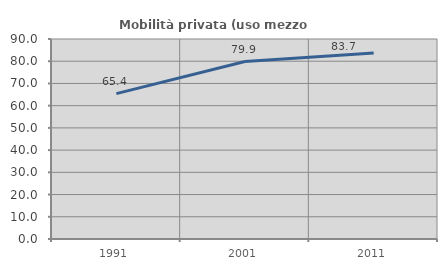
| Category | Mobilità privata (uso mezzo privato) |
|---|---|
| 1991.0 | 65.42 |
| 2001.0 | 79.875 |
| 2011.0 | 83.657 |